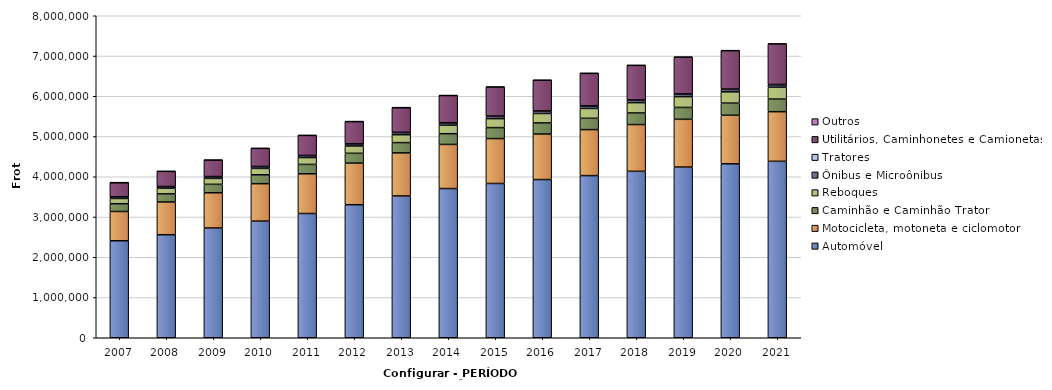
| Category | Automóvel | Motocicleta, motoneta e ciclomotor | Caminhão e Caminhão Trator | Reboques | Ônibus e Microônibus | Tratores | Utilitários, Caminhonetes e Camionetas | Outros |
|---|---|---|---|---|---|---|---|---|
| 2007 | 2409653 | 727725 | 193318 | 129984 | 39996 | 3400 | 349167 | 1972 |
| 2008 | 2559453 | 813776 | 201533 | 138889 | 40419 | 3858 | 376126 | 4496 |
| 2009 | 2726795 | 875494 | 209640 | 147151 | 42164 | 4300 | 407545 | 4557 |
| 2010 | 2898284 | 929824 | 221179 | 157643 | 44521 | 5113 | 448341 | 4709 |
| 2011 | 3086934 | 986762 | 233363 | 169490 | 47641 | 5869 | 496926 | 4946 |
| 2012 | 3305134 | 1033842 | 243366 | 181801 | 50219 | 6498 | 550216 | 5226 |
| 2013 | 3522607 | 1069708 | 256447 | 196601 | 52923 | 6880 | 611265 | 5473 |
| 2014 | 3707055 | 1095707 | 266995 | 210784 | 55119 | 7178 | 675150 | 5708 |
| 2015 | 3832828 | 1115776 | 272515 | 222823 | 56413 | 7437 | 721048 | 5930 |
| 2016 | 3930356 | 1130996 | 276645 | 233668 | 57228 | 7603 | 760928 | 6118 |
| 2017 | 4028444 | 1142793 | 281048 | 244670 | 57714 | 7735 | 806015 | 6281 |
| 2018 | 4135423 | 1161934 | 287508 | 256231 | 58822 | 7926 | 858483 | 6437 |
| 2019 | 4240842 | 1186315 | 295115 | 268316 | 59946 | 8188 | 911804 | 7078 |
| 2020 | 4321142 | 1206638 | 301846 | 280206 | 60075 | 8396 | 954827 | 7888 |
| 2021 | 4383723 | 1233254 | 313043 | 294912 | 59909 | 8634 | 1005580 | 9147 |